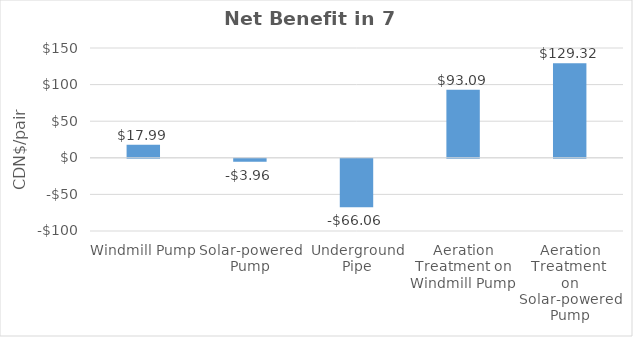
| Category | Net Benefits in 7 Year
($/head) |
|---|---|
| Windmill Pump | 17.993 |
| Solar-powered Pump | -3.959 |
| Underground Pipe | -66.059 |
| Aeration Treatment on Windmill Pump | 93.091 |
| Aeration Treatment 
on Solar-powered Pump | 129.316 |